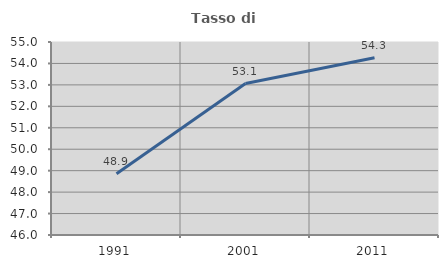
| Category | Tasso di occupazione   |
|---|---|
| 1991.0 | 48.852 |
| 2001.0 | 53.064 |
| 2011.0 | 54.264 |